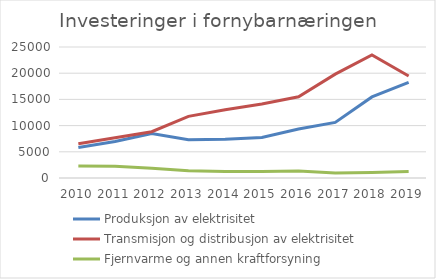
| Category | Produksjon av elektrisitet | Transmisjon og distribusjon av elektrisitet | Fjernvarme og annen kraftforsyning |
|---|---|---|---|
| 2010 | 5804 | 6518 | 2291 |
| 2011 | 6968 | 7681 | 2224 |
| 2012 | 8466 | 8839 | 1872 |
| 2013 | 7287 | 11762 | 1373 |
| 2014 | 7405 | 13035 | 1237 |
| 2015 | 7747 | 14123 | 1244 |
| 2016 | 9363 | 15504 | 1355 |
| 2017 | 10610 | 19823 | 963 |
| 2018 | 15469 | 23483 | 1029 |
| 2019 | 18267 | 19474 | 1222 |